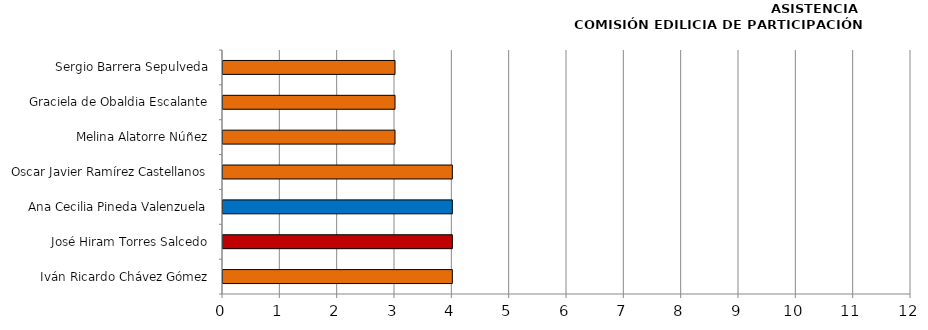
| Category | Series 0 |
|---|---|
| Iván Ricardo Chávez Gómez | 4 |
| José Hiram Torres Salcedo | 4 |
| Ana Cecilia Pineda Valenzuela | 4 |
| Oscar Javier Ramírez Castellanos | 4 |
| Melina Alatorre Núñez | 3 |
| Graciela de Obaldia Escalante | 3 |
| Sergio Barrera Sepulveda | 3 |